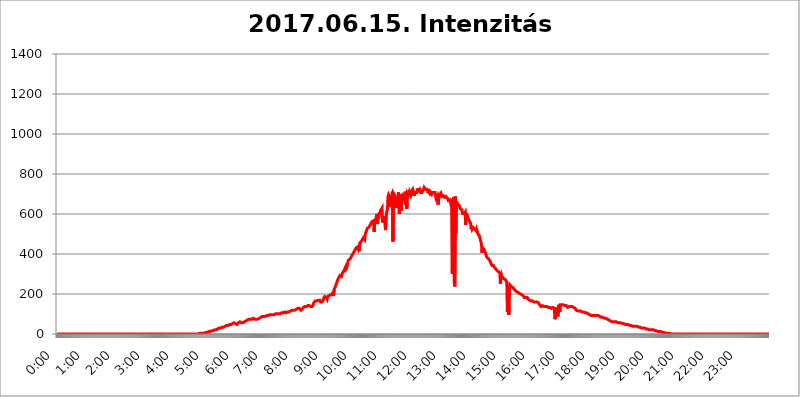
| Category | 2017.06.15. Intenzitás [W/m^2] |
|---|---|
| 0.0 | 0 |
| 0.0006944444444444445 | 0 |
| 0.001388888888888889 | 0 |
| 0.0020833333333333333 | 0 |
| 0.002777777777777778 | 0 |
| 0.003472222222222222 | 0 |
| 0.004166666666666667 | 0 |
| 0.004861111111111111 | 0 |
| 0.005555555555555556 | 0 |
| 0.0062499999999999995 | 0 |
| 0.006944444444444444 | 0 |
| 0.007638888888888889 | 0 |
| 0.008333333333333333 | 0 |
| 0.009027777777777779 | 0 |
| 0.009722222222222222 | 0 |
| 0.010416666666666666 | 0 |
| 0.011111111111111112 | 0 |
| 0.011805555555555555 | 0 |
| 0.012499999999999999 | 0 |
| 0.013194444444444444 | 0 |
| 0.013888888888888888 | 0 |
| 0.014583333333333332 | 0 |
| 0.015277777777777777 | 0 |
| 0.015972222222222224 | 0 |
| 0.016666666666666666 | 0 |
| 0.017361111111111112 | 0 |
| 0.018055555555555557 | 0 |
| 0.01875 | 0 |
| 0.019444444444444445 | 0 |
| 0.02013888888888889 | 0 |
| 0.020833333333333332 | 0 |
| 0.02152777777777778 | 0 |
| 0.022222222222222223 | 0 |
| 0.02291666666666667 | 0 |
| 0.02361111111111111 | 0 |
| 0.024305555555555556 | 0 |
| 0.024999999999999998 | 0 |
| 0.025694444444444447 | 0 |
| 0.02638888888888889 | 0 |
| 0.027083333333333334 | 0 |
| 0.027777777777777776 | 0 |
| 0.02847222222222222 | 0 |
| 0.029166666666666664 | 0 |
| 0.029861111111111113 | 0 |
| 0.030555555555555555 | 0 |
| 0.03125 | 0 |
| 0.03194444444444445 | 0 |
| 0.03263888888888889 | 0 |
| 0.03333333333333333 | 0 |
| 0.034027777777777775 | 0 |
| 0.034722222222222224 | 0 |
| 0.035416666666666666 | 0 |
| 0.036111111111111115 | 0 |
| 0.03680555555555556 | 0 |
| 0.0375 | 0 |
| 0.03819444444444444 | 0 |
| 0.03888888888888889 | 0 |
| 0.03958333333333333 | 0 |
| 0.04027777777777778 | 0 |
| 0.04097222222222222 | 0 |
| 0.041666666666666664 | 0 |
| 0.042361111111111106 | 0 |
| 0.04305555555555556 | 0 |
| 0.043750000000000004 | 0 |
| 0.044444444444444446 | 0 |
| 0.04513888888888889 | 0 |
| 0.04583333333333334 | 0 |
| 0.04652777777777778 | 0 |
| 0.04722222222222222 | 0 |
| 0.04791666666666666 | 0 |
| 0.04861111111111111 | 0 |
| 0.049305555555555554 | 0 |
| 0.049999999999999996 | 0 |
| 0.05069444444444445 | 0 |
| 0.051388888888888894 | 0 |
| 0.052083333333333336 | 0 |
| 0.05277777777777778 | 0 |
| 0.05347222222222222 | 0 |
| 0.05416666666666667 | 0 |
| 0.05486111111111111 | 0 |
| 0.05555555555555555 | 0 |
| 0.05625 | 0 |
| 0.05694444444444444 | 0 |
| 0.057638888888888885 | 0 |
| 0.05833333333333333 | 0 |
| 0.05902777777777778 | 0 |
| 0.059722222222222225 | 0 |
| 0.06041666666666667 | 0 |
| 0.061111111111111116 | 0 |
| 0.06180555555555556 | 0 |
| 0.0625 | 0 |
| 0.06319444444444444 | 0 |
| 0.06388888888888888 | 0 |
| 0.06458333333333334 | 0 |
| 0.06527777777777778 | 0 |
| 0.06597222222222222 | 0 |
| 0.06666666666666667 | 0 |
| 0.06736111111111111 | 0 |
| 0.06805555555555555 | 0 |
| 0.06874999999999999 | 0 |
| 0.06944444444444443 | 0 |
| 0.07013888888888889 | 0 |
| 0.07083333333333333 | 0 |
| 0.07152777777777779 | 0 |
| 0.07222222222222223 | 0 |
| 0.07291666666666667 | 0 |
| 0.07361111111111111 | 0 |
| 0.07430555555555556 | 0 |
| 0.075 | 0 |
| 0.07569444444444444 | 0 |
| 0.0763888888888889 | 0 |
| 0.07708333333333334 | 0 |
| 0.07777777777777778 | 0 |
| 0.07847222222222222 | 0 |
| 0.07916666666666666 | 0 |
| 0.0798611111111111 | 0 |
| 0.08055555555555556 | 0 |
| 0.08125 | 0 |
| 0.08194444444444444 | 0 |
| 0.08263888888888889 | 0 |
| 0.08333333333333333 | 0 |
| 0.08402777777777777 | 0 |
| 0.08472222222222221 | 0 |
| 0.08541666666666665 | 0 |
| 0.08611111111111112 | 0 |
| 0.08680555555555557 | 0 |
| 0.08750000000000001 | 0 |
| 0.08819444444444445 | 0 |
| 0.08888888888888889 | 0 |
| 0.08958333333333333 | 0 |
| 0.09027777777777778 | 0 |
| 0.09097222222222222 | 0 |
| 0.09166666666666667 | 0 |
| 0.09236111111111112 | 0 |
| 0.09305555555555556 | 0 |
| 0.09375 | 0 |
| 0.09444444444444444 | 0 |
| 0.09513888888888888 | 0 |
| 0.09583333333333333 | 0 |
| 0.09652777777777777 | 0 |
| 0.09722222222222222 | 0 |
| 0.09791666666666667 | 0 |
| 0.09861111111111111 | 0 |
| 0.09930555555555555 | 0 |
| 0.09999999999999999 | 0 |
| 0.10069444444444443 | 0 |
| 0.1013888888888889 | 0 |
| 0.10208333333333335 | 0 |
| 0.10277777777777779 | 0 |
| 0.10347222222222223 | 0 |
| 0.10416666666666667 | 0 |
| 0.10486111111111111 | 0 |
| 0.10555555555555556 | 0 |
| 0.10625 | 0 |
| 0.10694444444444444 | 0 |
| 0.1076388888888889 | 0 |
| 0.10833333333333334 | 0 |
| 0.10902777777777778 | 0 |
| 0.10972222222222222 | 0 |
| 0.1111111111111111 | 0 |
| 0.11180555555555556 | 0 |
| 0.11180555555555556 | 0 |
| 0.1125 | 0 |
| 0.11319444444444444 | 0 |
| 0.11388888888888889 | 0 |
| 0.11458333333333333 | 0 |
| 0.11527777777777777 | 0 |
| 0.11597222222222221 | 0 |
| 0.11666666666666665 | 0 |
| 0.1173611111111111 | 0 |
| 0.11805555555555557 | 0 |
| 0.11944444444444445 | 0 |
| 0.12013888888888889 | 0 |
| 0.12083333333333333 | 0 |
| 0.12152777777777778 | 0 |
| 0.12222222222222223 | 0 |
| 0.12291666666666667 | 0 |
| 0.12291666666666667 | 0 |
| 0.12361111111111112 | 0 |
| 0.12430555555555556 | 0 |
| 0.125 | 0 |
| 0.12569444444444444 | 0 |
| 0.12638888888888888 | 0 |
| 0.12708333333333333 | 0 |
| 0.16875 | 0 |
| 0.12847222222222224 | 0 |
| 0.12916666666666668 | 0 |
| 0.12986111111111112 | 0 |
| 0.13055555555555556 | 0 |
| 0.13125 | 0 |
| 0.13194444444444445 | 0 |
| 0.1326388888888889 | 0 |
| 0.13333333333333333 | 0 |
| 0.13402777777777777 | 0 |
| 0.13402777777777777 | 0 |
| 0.13472222222222222 | 0 |
| 0.13541666666666666 | 0 |
| 0.1361111111111111 | 0 |
| 0.13749999999999998 | 0 |
| 0.13819444444444443 | 0 |
| 0.1388888888888889 | 0 |
| 0.13958333333333334 | 0 |
| 0.14027777777777778 | 0 |
| 0.14097222222222222 | 0 |
| 0.14166666666666666 | 0 |
| 0.1423611111111111 | 0 |
| 0.14305555555555557 | 0 |
| 0.14375000000000002 | 0 |
| 0.14444444444444446 | 0 |
| 0.1451388888888889 | 0 |
| 0.1451388888888889 | 0 |
| 0.14652777777777778 | 0 |
| 0.14722222222222223 | 0 |
| 0.14791666666666667 | 0 |
| 0.1486111111111111 | 0 |
| 0.14930555555555555 | 0 |
| 0.15 | 0 |
| 0.15069444444444444 | 0 |
| 0.15138888888888888 | 0 |
| 0.15208333333333332 | 0 |
| 0.15277777777777776 | 0 |
| 0.15347222222222223 | 0 |
| 0.15416666666666667 | 0 |
| 0.15486111111111112 | 0 |
| 0.15555555555555556 | 0 |
| 0.15625 | 0 |
| 0.15694444444444444 | 0 |
| 0.15763888888888888 | 0 |
| 0.15833333333333333 | 0 |
| 0.15902777777777777 | 0 |
| 0.15972222222222224 | 0 |
| 0.16041666666666668 | 0 |
| 0.16111111111111112 | 0 |
| 0.16180555555555556 | 0 |
| 0.1625 | 0 |
| 0.16319444444444445 | 0 |
| 0.1638888888888889 | 0 |
| 0.16458333333333333 | 0 |
| 0.16527777777777777 | 0 |
| 0.16597222222222222 | 0 |
| 0.16666666666666666 | 0 |
| 0.1673611111111111 | 0 |
| 0.16805555555555554 | 0 |
| 0.16874999999999998 | 0 |
| 0.16944444444444443 | 0 |
| 0.17013888888888887 | 0 |
| 0.1708333333333333 | 0 |
| 0.17152777777777775 | 0 |
| 0.17222222222222225 | 0 |
| 0.1729166666666667 | 0 |
| 0.17361111111111113 | 0 |
| 0.17430555555555557 | 0 |
| 0.17500000000000002 | 0 |
| 0.17569444444444446 | 0 |
| 0.1763888888888889 | 0 |
| 0.17708333333333334 | 0 |
| 0.17777777777777778 | 0 |
| 0.17847222222222223 | 0 |
| 0.17916666666666667 | 0 |
| 0.1798611111111111 | 0 |
| 0.18055555555555555 | 0 |
| 0.18125 | 0 |
| 0.18194444444444444 | 0 |
| 0.1826388888888889 | 0 |
| 0.18333333333333335 | 0 |
| 0.1840277777777778 | 0 |
| 0.18472222222222223 | 0 |
| 0.18541666666666667 | 0 |
| 0.18611111111111112 | 0 |
| 0.18680555555555556 | 0 |
| 0.1875 | 0 |
| 0.18819444444444444 | 0 |
| 0.18888888888888888 | 0 |
| 0.18958333333333333 | 0 |
| 0.19027777777777777 | 0 |
| 0.1909722222222222 | 0 |
| 0.19166666666666665 | 0 |
| 0.19236111111111112 | 0 |
| 0.19305555555555554 | 0 |
| 0.19375 | 0 |
| 0.19444444444444445 | 0 |
| 0.1951388888888889 | 0 |
| 0.19583333333333333 | 0 |
| 0.19652777777777777 | 0 |
| 0.19722222222222222 | 0 |
| 0.19791666666666666 | 0 |
| 0.1986111111111111 | 0 |
| 0.19930555555555554 | 3.525 |
| 0.19999999999999998 | 3.525 |
| 0.20069444444444443 | 3.525 |
| 0.20138888888888887 | 3.525 |
| 0.2020833333333333 | 3.525 |
| 0.2027777777777778 | 3.525 |
| 0.2034722222222222 | 3.525 |
| 0.2041666666666667 | 3.525 |
| 0.20486111111111113 | 3.525 |
| 0.20555555555555557 | 3.525 |
| 0.20625000000000002 | 3.525 |
| 0.20694444444444446 | 7.887 |
| 0.2076388888888889 | 3.525 |
| 0.20833333333333334 | 7.887 |
| 0.20902777777777778 | 7.887 |
| 0.20972222222222223 | 7.887 |
| 0.21041666666666667 | 7.887 |
| 0.2111111111111111 | 12.257 |
| 0.21180555555555555 | 12.257 |
| 0.2125 | 12.257 |
| 0.21319444444444444 | 12.257 |
| 0.2138888888888889 | 12.257 |
| 0.21458333333333335 | 12.257 |
| 0.2152777777777778 | 16.636 |
| 0.21597222222222223 | 16.636 |
| 0.21666666666666667 | 16.636 |
| 0.21736111111111112 | 16.636 |
| 0.21805555555555556 | 16.636 |
| 0.21875 | 16.636 |
| 0.21944444444444444 | 21.024 |
| 0.22013888888888888 | 21.024 |
| 0.22083333333333333 | 21.024 |
| 0.22152777777777777 | 21.024 |
| 0.2222222222222222 | 21.024 |
| 0.22291666666666665 | 21.024 |
| 0.2236111111111111 | 25.419 |
| 0.22430555555555556 | 25.419 |
| 0.225 | 25.419 |
| 0.22569444444444445 | 25.419 |
| 0.2263888888888889 | 29.823 |
| 0.22708333333333333 | 29.823 |
| 0.22777777777777777 | 29.823 |
| 0.22847222222222222 | 29.823 |
| 0.22916666666666666 | 29.823 |
| 0.2298611111111111 | 34.234 |
| 0.23055555555555554 | 34.234 |
| 0.23124999999999998 | 34.234 |
| 0.23194444444444443 | 34.234 |
| 0.23263888888888887 | 34.234 |
| 0.2333333333333333 | 34.234 |
| 0.2340277777777778 | 38.653 |
| 0.2347222222222222 | 38.653 |
| 0.2354166666666667 | 38.653 |
| 0.23611111111111113 | 38.653 |
| 0.23680555555555557 | 38.653 |
| 0.23750000000000002 | 43.079 |
| 0.23819444444444446 | 43.079 |
| 0.2388888888888889 | 43.079 |
| 0.23958333333333334 | 43.079 |
| 0.24027777777777778 | 47.511 |
| 0.24097222222222223 | 47.511 |
| 0.24166666666666667 | 47.511 |
| 0.2423611111111111 | 47.511 |
| 0.24305555555555555 | 47.511 |
| 0.24375 | 47.511 |
| 0.24444444444444446 | 51.951 |
| 0.24513888888888888 | 51.951 |
| 0.24583333333333335 | 51.951 |
| 0.2465277777777778 | 51.951 |
| 0.24722222222222223 | 51.951 |
| 0.24791666666666667 | 56.398 |
| 0.24861111111111112 | 51.951 |
| 0.24930555555555556 | 51.951 |
| 0.25 | 51.951 |
| 0.25069444444444444 | 51.951 |
| 0.2513888888888889 | 51.951 |
| 0.2520833333333333 | 47.511 |
| 0.25277777777777777 | 47.511 |
| 0.2534722222222222 | 47.511 |
| 0.25416666666666665 | 56.398 |
| 0.2548611111111111 | 56.398 |
| 0.2555555555555556 | 60.85 |
| 0.25625000000000003 | 60.85 |
| 0.2569444444444445 | 60.85 |
| 0.2576388888888889 | 60.85 |
| 0.25833333333333336 | 56.398 |
| 0.2590277777777778 | 56.398 |
| 0.25972222222222224 | 56.398 |
| 0.2604166666666667 | 56.398 |
| 0.2611111111111111 | 56.398 |
| 0.26180555555555557 | 51.951 |
| 0.2625 | 60.85 |
| 0.26319444444444445 | 60.85 |
| 0.2638888888888889 | 60.85 |
| 0.26458333333333334 | 65.31 |
| 0.2652777777777778 | 69.775 |
| 0.2659722222222222 | 69.775 |
| 0.26666666666666666 | 69.775 |
| 0.2673611111111111 | 69.775 |
| 0.26805555555555555 | 74.246 |
| 0.26875 | 74.246 |
| 0.26944444444444443 | 74.246 |
| 0.2701388888888889 | 74.246 |
| 0.2708333333333333 | 74.246 |
| 0.27152777777777776 | 74.246 |
| 0.2722222222222222 | 74.246 |
| 0.27291666666666664 | 74.246 |
| 0.2736111111111111 | 74.246 |
| 0.2743055555555555 | 78.722 |
| 0.27499999999999997 | 78.722 |
| 0.27569444444444446 | 74.246 |
| 0.27638888888888885 | 74.246 |
| 0.27708333333333335 | 74.246 |
| 0.2777777777777778 | 74.246 |
| 0.27847222222222223 | 74.246 |
| 0.2791666666666667 | 74.246 |
| 0.2798611111111111 | 74.246 |
| 0.28055555555555556 | 74.246 |
| 0.28125 | 74.246 |
| 0.28194444444444444 | 78.722 |
| 0.2826388888888889 | 78.722 |
| 0.2833333333333333 | 78.722 |
| 0.28402777777777777 | 78.722 |
| 0.2847222222222222 | 78.722 |
| 0.28541666666666665 | 83.205 |
| 0.28611111111111115 | 83.205 |
| 0.28680555555555554 | 83.205 |
| 0.28750000000000003 | 87.692 |
| 0.2881944444444445 | 83.205 |
| 0.2888888888888889 | 87.692 |
| 0.28958333333333336 | 87.692 |
| 0.2902777777777778 | 87.692 |
| 0.29097222222222224 | 87.692 |
| 0.2916666666666667 | 87.692 |
| 0.2923611111111111 | 92.184 |
| 0.29305555555555557 | 92.184 |
| 0.29375 | 92.184 |
| 0.29444444444444445 | 92.184 |
| 0.2951388888888889 | 92.184 |
| 0.29583333333333334 | 92.184 |
| 0.2965277777777778 | 92.184 |
| 0.2972222222222222 | 96.682 |
| 0.29791666666666666 | 96.682 |
| 0.2986111111111111 | 96.682 |
| 0.29930555555555555 | 96.682 |
| 0.3 | 96.682 |
| 0.30069444444444443 | 96.682 |
| 0.3013888888888889 | 96.682 |
| 0.3020833333333333 | 96.682 |
| 0.30277777777777776 | 96.682 |
| 0.3034722222222222 | 101.184 |
| 0.30416666666666664 | 96.682 |
| 0.3048611111111111 | 101.184 |
| 0.3055555555555555 | 101.184 |
| 0.30624999999999997 | 101.184 |
| 0.3069444444444444 | 101.184 |
| 0.3076388888888889 | 101.184 |
| 0.30833333333333335 | 101.184 |
| 0.3090277777777778 | 101.184 |
| 0.30972222222222223 | 96.682 |
| 0.3104166666666667 | 101.184 |
| 0.3111111111111111 | 101.184 |
| 0.31180555555555556 | 101.184 |
| 0.3125 | 101.184 |
| 0.31319444444444444 | 105.69 |
| 0.3138888888888889 | 105.69 |
| 0.3145833333333333 | 105.69 |
| 0.31527777777777777 | 105.69 |
| 0.3159722222222222 | 105.69 |
| 0.31666666666666665 | 105.69 |
| 0.31736111111111115 | 105.69 |
| 0.31805555555555554 | 105.69 |
| 0.31875000000000003 | 110.201 |
| 0.3194444444444445 | 110.201 |
| 0.3201388888888889 | 105.69 |
| 0.32083333333333336 | 105.69 |
| 0.3215277777777778 | 105.69 |
| 0.32222222222222224 | 110.201 |
| 0.3229166666666667 | 110.201 |
| 0.3236111111111111 | 110.201 |
| 0.32430555555555557 | 110.201 |
| 0.325 | 110.201 |
| 0.32569444444444445 | 114.716 |
| 0.3263888888888889 | 114.716 |
| 0.32708333333333334 | 114.716 |
| 0.3277777777777778 | 114.716 |
| 0.3284722222222222 | 119.235 |
| 0.32916666666666666 | 119.235 |
| 0.3298611111111111 | 119.235 |
| 0.33055555555555555 | 119.235 |
| 0.33125 | 119.235 |
| 0.33194444444444443 | 119.235 |
| 0.3326388888888889 | 119.235 |
| 0.3333333333333333 | 119.235 |
| 0.3340277777777778 | 119.235 |
| 0.3347222222222222 | 123.758 |
| 0.3354166666666667 | 123.758 |
| 0.3361111111111111 | 128.284 |
| 0.3368055555555556 | 128.284 |
| 0.33749999999999997 | 128.284 |
| 0.33819444444444446 | 128.284 |
| 0.33888888888888885 | 128.284 |
| 0.33958333333333335 | 128.284 |
| 0.34027777777777773 | 128.284 |
| 0.34097222222222223 | 128.284 |
| 0.3416666666666666 | 119.235 |
| 0.3423611111111111 | 123.758 |
| 0.3430555555555555 | 123.758 |
| 0.34375 | 123.758 |
| 0.3444444444444445 | 128.284 |
| 0.3451388888888889 | 132.814 |
| 0.3458333333333334 | 132.814 |
| 0.34652777777777777 | 132.814 |
| 0.34722222222222227 | 137.347 |
| 0.34791666666666665 | 137.347 |
| 0.34861111111111115 | 132.814 |
| 0.34930555555555554 | 137.347 |
| 0.35000000000000003 | 137.347 |
| 0.3506944444444444 | 137.347 |
| 0.3513888888888889 | 141.884 |
| 0.3520833333333333 | 141.884 |
| 0.3527777777777778 | 146.423 |
| 0.3534722222222222 | 141.884 |
| 0.3541666666666667 | 141.884 |
| 0.3548611111111111 | 146.423 |
| 0.35555555555555557 | 137.347 |
| 0.35625 | 132.814 |
| 0.35694444444444445 | 141.884 |
| 0.3576388888888889 | 137.347 |
| 0.35833333333333334 | 141.884 |
| 0.3590277777777778 | 146.423 |
| 0.3597222222222222 | 155.509 |
| 0.36041666666666666 | 155.509 |
| 0.3611111111111111 | 160.056 |
| 0.36180555555555555 | 164.605 |
| 0.3625 | 164.605 |
| 0.36319444444444443 | 164.605 |
| 0.3638888888888889 | 164.605 |
| 0.3645833333333333 | 160.056 |
| 0.3652777777777778 | 164.605 |
| 0.3659722222222222 | 169.156 |
| 0.3666666666666667 | 164.605 |
| 0.3673611111111111 | 169.156 |
| 0.3680555555555556 | 169.156 |
| 0.36874999999999997 | 164.605 |
| 0.36944444444444446 | 160.056 |
| 0.37013888888888885 | 155.509 |
| 0.37083333333333335 | 160.056 |
| 0.37152777777777773 | 160.056 |
| 0.37222222222222223 | 155.509 |
| 0.3729166666666666 | 169.156 |
| 0.3736111111111111 | 178.264 |
| 0.3743055555555555 | 173.709 |
| 0.375 | 187.378 |
| 0.3756944444444445 | 187.378 |
| 0.3763888888888889 | 191.937 |
| 0.3770833333333334 | 182.82 |
| 0.37777777777777777 | 182.82 |
| 0.37847222222222227 | 173.709 |
| 0.37916666666666665 | 187.378 |
| 0.37986111111111115 | 182.82 |
| 0.38055555555555554 | 182.82 |
| 0.38125000000000003 | 191.937 |
| 0.3819444444444444 | 191.937 |
| 0.3826388888888889 | 196.497 |
| 0.3833333333333333 | 196.497 |
| 0.3840277777777778 | 191.937 |
| 0.3847222222222222 | 191.937 |
| 0.3854166666666667 | 196.497 |
| 0.3861111111111111 | 201.058 |
| 0.38680555555555557 | 210.182 |
| 0.3875 | 191.937 |
| 0.38819444444444445 | 219.309 |
| 0.3888888888888889 | 219.309 |
| 0.38958333333333334 | 233 |
| 0.3902777777777778 | 237.564 |
| 0.3909722222222222 | 246.689 |
| 0.39166666666666666 | 251.251 |
| 0.3923611111111111 | 260.373 |
| 0.39305555555555555 | 264.932 |
| 0.39375 | 274.047 |
| 0.39444444444444443 | 278.603 |
| 0.3951388888888889 | 283.156 |
| 0.3958333333333333 | 287.709 |
| 0.3965277777777778 | 292.259 |
| 0.3972222222222222 | 287.709 |
| 0.3979166666666667 | 292.259 |
| 0.3986111111111111 | 287.709 |
| 0.3993055555555556 | 296.808 |
| 0.39999999999999997 | 305.898 |
| 0.40069444444444446 | 310.44 |
| 0.40138888888888885 | 310.44 |
| 0.40208333333333335 | 314.98 |
| 0.40277777777777773 | 314.98 |
| 0.40347222222222223 | 319.517 |
| 0.4041666666666666 | 333.113 |
| 0.4048611111111111 | 324.052 |
| 0.4055555555555555 | 328.584 |
| 0.40625 | 333.113 |
| 0.4069444444444445 | 346.682 |
| 0.4076388888888889 | 360.221 |
| 0.4083333333333334 | 369.23 |
| 0.40902777777777777 | 369.23 |
| 0.40972222222222227 | 369.23 |
| 0.41041666666666665 | 373.729 |
| 0.41111111111111115 | 378.224 |
| 0.41180555555555554 | 382.715 |
| 0.41250000000000003 | 387.202 |
| 0.4131944444444444 | 391.685 |
| 0.4138888888888889 | 396.164 |
| 0.4145833333333333 | 400.638 |
| 0.4152777777777778 | 405.108 |
| 0.4159722222222222 | 405.108 |
| 0.4166666666666667 | 414.035 |
| 0.4173611111111111 | 418.492 |
| 0.41805555555555557 | 422.943 |
| 0.41875 | 427.39 |
| 0.41944444444444445 | 431.833 |
| 0.4201388888888889 | 431.833 |
| 0.42083333333333334 | 436.27 |
| 0.4215277777777778 | 436.27 |
| 0.4222222222222222 | 427.39 |
| 0.42291666666666666 | 436.27 |
| 0.4236111111111111 | 414.035 |
| 0.42430555555555555 | 453.968 |
| 0.425 | 458.38 |
| 0.42569444444444443 | 458.38 |
| 0.4263888888888889 | 462.786 |
| 0.4270833333333333 | 467.187 |
| 0.4277777777777778 | 471.582 |
| 0.4284722222222222 | 475.972 |
| 0.4291666666666667 | 480.356 |
| 0.4298611111111111 | 480.356 |
| 0.4305555555555556 | 475.972 |
| 0.43124999999999997 | 471.582 |
| 0.43194444444444446 | 497.836 |
| 0.43263888888888885 | 506.542 |
| 0.43333333333333335 | 510.885 |
| 0.43402777777777773 | 519.555 |
| 0.43472222222222223 | 528.2 |
| 0.4354166666666666 | 528.2 |
| 0.4361111111111111 | 532.513 |
| 0.4368055555555555 | 532.513 |
| 0.4375 | 532.513 |
| 0.4381944444444445 | 541.121 |
| 0.4388888888888889 | 541.121 |
| 0.4395833333333334 | 549.704 |
| 0.44027777777777777 | 553.986 |
| 0.44097222222222227 | 553.986 |
| 0.44166666666666665 | 562.53 |
| 0.44236111111111115 | 558.261 |
| 0.44305555555555554 | 566.793 |
| 0.44375000000000003 | 566.793 |
| 0.4444444444444444 | 510.885 |
| 0.4451388888888889 | 553.986 |
| 0.4458333333333333 | 549.704 |
| 0.4465277777777778 | 566.793 |
| 0.4472222222222222 | 566.793 |
| 0.4479166666666667 | 592.233 |
| 0.4486111111111111 | 600.661 |
| 0.44930555555555557 | 549.704 |
| 0.45 | 588.009 |
| 0.45069444444444445 | 575.299 |
| 0.4513888888888889 | 596.45 |
| 0.45208333333333334 | 609.062 |
| 0.4527777777777778 | 596.45 |
| 0.4534722222222222 | 617.436 |
| 0.45416666666666666 | 617.436 |
| 0.4548611111111111 | 613.252 |
| 0.45555555555555555 | 629.948 |
| 0.45625 | 558.261 |
| 0.45694444444444443 | 571.049 |
| 0.4576388888888889 | 558.261 |
| 0.4583333333333333 | 588.009 |
| 0.4590277777777778 | 575.299 |
| 0.4597222222222222 | 545.416 |
| 0.4604166666666667 | 519.555 |
| 0.4611111111111111 | 558.261 |
| 0.4618055555555556 | 604.864 |
| 0.46249999999999997 | 609.062 |
| 0.46319444444444446 | 625.784 |
| 0.46388888888888885 | 687.544 |
| 0.46458333333333335 | 695.666 |
| 0.46527777777777773 | 695.666 |
| 0.46597222222222223 | 683.473 |
| 0.4666666666666666 | 634.105 |
| 0.4673611111111111 | 634.105 |
| 0.4680555555555555 | 691.608 |
| 0.46875 | 675.311 |
| 0.4694444444444445 | 695.666 |
| 0.4701388888888889 | 711.832 |
| 0.4708333333333334 | 462.786 |
| 0.47152777777777777 | 703.762 |
| 0.47222222222222227 | 703.762 |
| 0.47291666666666665 | 699.717 |
| 0.47361111111111115 | 691.608 |
| 0.47430555555555554 | 679.395 |
| 0.47500000000000003 | 629.948 |
| 0.4756944444444444 | 642.4 |
| 0.4763888888888889 | 650.667 |
| 0.4770833333333333 | 671.22 |
| 0.4777777777777778 | 683.473 |
| 0.4784722222222222 | 707.8 |
| 0.4791666666666667 | 703.762 |
| 0.4798611111111111 | 600.661 |
| 0.48055555555555557 | 699.717 |
| 0.48125 | 683.473 |
| 0.48194444444444445 | 687.544 |
| 0.4826388888888889 | 617.436 |
| 0.48333333333333334 | 683.473 |
| 0.4840277777777778 | 691.608 |
| 0.4847222222222222 | 691.608 |
| 0.48541666666666666 | 683.473 |
| 0.4861111111111111 | 683.473 |
| 0.48680555555555555 | 663.019 |
| 0.4875 | 703.762 |
| 0.48819444444444443 | 711.832 |
| 0.4888888888888889 | 646.537 |
| 0.4895833333333333 | 695.666 |
| 0.4902777777777778 | 625.784 |
| 0.4909722222222222 | 703.762 |
| 0.4916666666666667 | 707.8 |
| 0.4923611111111111 | 695.666 |
| 0.4930555555555556 | 699.717 |
| 0.49374999999999997 | 711.832 |
| 0.49444444444444446 | 703.762 |
| 0.49513888888888885 | 703.762 |
| 0.49583333333333335 | 691.608 |
| 0.49652777777777773 | 699.717 |
| 0.49722222222222223 | 715.858 |
| 0.4979166666666666 | 711.832 |
| 0.4986111111111111 | 723.889 |
| 0.4993055555555555 | 719.877 |
| 0.5 | 703.762 |
| 0.5006944444444444 | 691.608 |
| 0.5013888888888889 | 695.666 |
| 0.5020833333333333 | 707.8 |
| 0.5027777777777778 | 707.8 |
| 0.5034722222222222 | 711.832 |
| 0.5041666666666667 | 707.8 |
| 0.5048611111111111 | 715.858 |
| 0.5055555555555555 | 727.896 |
| 0.50625 | 715.858 |
| 0.5069444444444444 | 711.832 |
| 0.5076388888888889 | 715.858 |
| 0.5083333333333333 | 723.889 |
| 0.5090277777777777 | 723.889 |
| 0.5097222222222222 | 707.8 |
| 0.5104166666666666 | 711.832 |
| 0.5111111111111112 | 703.762 |
| 0.5118055555555555 | 707.8 |
| 0.5125000000000001 | 715.858 |
| 0.5131944444444444 | 719.877 |
| 0.513888888888889 | 723.889 |
| 0.5145833333333333 | 731.896 |
| 0.5152777777777778 | 727.896 |
| 0.5159722222222222 | 723.889 |
| 0.5166666666666667 | 727.896 |
| 0.517361111111111 | 719.877 |
| 0.5180555555555556 | 723.889 |
| 0.5187499999999999 | 723.889 |
| 0.5194444444444445 | 715.858 |
| 0.5201388888888888 | 703.762 |
| 0.5208333333333334 | 711.832 |
| 0.5215277777777778 | 707.8 |
| 0.5222222222222223 | 703.762 |
| 0.5229166666666667 | 711.832 |
| 0.5236111111111111 | 711.832 |
| 0.5243055555555556 | 711.832 |
| 0.525 | 699.717 |
| 0.5256944444444445 | 707.8 |
| 0.5263888888888889 | 703.762 |
| 0.5270833333333333 | 707.8 |
| 0.5277777777777778 | 707.8 |
| 0.5284722222222222 | 703.762 |
| 0.5291666666666667 | 703.762 |
| 0.5298611111111111 | 707.8 |
| 0.5305555555555556 | 695.666 |
| 0.53125 | 679.395 |
| 0.5319444444444444 | 683.473 |
| 0.5326388888888889 | 679.395 |
| 0.5333333333333333 | 691.608 |
| 0.5340277777777778 | 646.537 |
| 0.5347222222222222 | 667.123 |
| 0.5354166666666667 | 687.544 |
| 0.5361111111111111 | 691.608 |
| 0.5368055555555555 | 695.666 |
| 0.5375 | 699.717 |
| 0.5381944444444444 | 703.762 |
| 0.5388888888888889 | 695.666 |
| 0.5395833333333333 | 687.544 |
| 0.5402777777777777 | 687.544 |
| 0.5409722222222222 | 683.473 |
| 0.5416666666666666 | 691.608 |
| 0.5423611111111112 | 687.544 |
| 0.5430555555555555 | 683.473 |
| 0.5437500000000001 | 683.473 |
| 0.5444444444444444 | 683.473 |
| 0.545138888888889 | 687.544 |
| 0.5458333333333333 | 691.608 |
| 0.5465277777777778 | 683.473 |
| 0.5472222222222222 | 679.395 |
| 0.5479166666666667 | 675.311 |
| 0.548611111111111 | 667.123 |
| 0.5493055555555556 | 671.22 |
| 0.5499999999999999 | 671.22 |
| 0.5506944444444445 | 671.22 |
| 0.5513888888888888 | 663.019 |
| 0.5520833333333334 | 658.909 |
| 0.5527777777777778 | 638.256 |
| 0.5534722222222223 | 675.311 |
| 0.5541666666666667 | 301.354 |
| 0.5548611111111111 | 671.22 |
| 0.5555555555555556 | 541.121 |
| 0.55625 | 683.473 |
| 0.5569444444444445 | 255.813 |
| 0.5576388888888889 | 237.564 |
| 0.5583333333333333 | 687.544 |
| 0.5590277777777778 | 502.192 |
| 0.5597222222222222 | 663.019 |
| 0.5604166666666667 | 667.123 |
| 0.5611111111111111 | 658.909 |
| 0.5618055555555556 | 646.537 |
| 0.5625 | 642.4 |
| 0.5631944444444444 | 642.4 |
| 0.5638888888888889 | 642.4 |
| 0.5645833333333333 | 634.105 |
| 0.5652777777777778 | 625.784 |
| 0.5659722222222222 | 621.613 |
| 0.5666666666666667 | 621.613 |
| 0.5673611111111111 | 621.613 |
| 0.5680555555555555 | 609.062 |
| 0.56875 | 600.661 |
| 0.5694444444444444 | 600.661 |
| 0.5701388888888889 | 600.661 |
| 0.5708333333333333 | 600.661 |
| 0.5715277777777777 | 596.45 |
| 0.5722222222222222 | 609.062 |
| 0.5729166666666666 | 545.416 |
| 0.5736111111111112 | 604.864 |
| 0.5743055555555555 | 600.661 |
| 0.5750000000000001 | 592.233 |
| 0.5756944444444444 | 583.779 |
| 0.576388888888889 | 579.542 |
| 0.5770833333333333 | 571.049 |
| 0.5777777777777778 | 566.793 |
| 0.5784722222222222 | 566.793 |
| 0.5791666666666667 | 558.261 |
| 0.579861111111111 | 549.704 |
| 0.5805555555555556 | 523.88 |
| 0.5812499999999999 | 536.82 |
| 0.5819444444444445 | 523.88 |
| 0.5826388888888888 | 528.2 |
| 0.5833333333333334 | 532.513 |
| 0.5840277777777778 | 532.513 |
| 0.5847222222222223 | 528.2 |
| 0.5854166666666667 | 523.88 |
| 0.5861111111111111 | 523.88 |
| 0.5868055555555556 | 523.88 |
| 0.5875 | 515.223 |
| 0.5881944444444445 | 523.88 |
| 0.5888888888888889 | 515.223 |
| 0.5895833333333333 | 506.542 |
| 0.5902777777777778 | 497.836 |
| 0.5909722222222222 | 497.836 |
| 0.5916666666666667 | 493.475 |
| 0.5923611111111111 | 489.108 |
| 0.5930555555555556 | 475.972 |
| 0.59375 | 467.187 |
| 0.5944444444444444 | 458.38 |
| 0.5951388888888889 | 440.702 |
| 0.5958333333333333 | 405.108 |
| 0.5965277777777778 | 431.833 |
| 0.5972222222222222 | 431.833 |
| 0.5979166666666667 | 427.39 |
| 0.5986111111111111 | 422.943 |
| 0.5993055555555555 | 414.035 |
| 0.6 | 409.574 |
| 0.6006944444444444 | 405.108 |
| 0.6013888888888889 | 396.164 |
| 0.6020833333333333 | 387.202 |
| 0.6027777777777777 | 387.202 |
| 0.6034722222222222 | 382.715 |
| 0.6041666666666666 | 378.224 |
| 0.6048611111111112 | 378.224 |
| 0.6055555555555555 | 373.729 |
| 0.6062500000000001 | 369.23 |
| 0.6069444444444444 | 364.728 |
| 0.607638888888889 | 360.221 |
| 0.6083333333333333 | 351.198 |
| 0.6090277777777778 | 351.198 |
| 0.6097222222222222 | 342.162 |
| 0.6104166666666667 | 342.162 |
| 0.611111111111111 | 342.162 |
| 0.6118055555555556 | 342.162 |
| 0.6124999999999999 | 342.162 |
| 0.6131944444444445 | 333.113 |
| 0.6138888888888888 | 333.113 |
| 0.6145833333333334 | 328.584 |
| 0.6152777777777778 | 324.052 |
| 0.6159722222222223 | 324.052 |
| 0.6166666666666667 | 319.517 |
| 0.6173611111111111 | 314.98 |
| 0.6180555555555556 | 314.98 |
| 0.61875 | 310.44 |
| 0.6194444444444445 | 310.44 |
| 0.6201388888888889 | 305.898 |
| 0.6208333333333333 | 301.354 |
| 0.6215277777777778 | 251.251 |
| 0.6222222222222222 | 287.709 |
| 0.6229166666666667 | 296.808 |
| 0.6236111111111111 | 287.709 |
| 0.6243055555555556 | 287.709 |
| 0.625 | 283.156 |
| 0.6256944444444444 | 278.603 |
| 0.6263888888888889 | 278.603 |
| 0.6270833333333333 | 278.603 |
| 0.6277777777777778 | 274.047 |
| 0.6284722222222222 | 269.49 |
| 0.6291666666666667 | 269.49 |
| 0.6298611111111111 | 264.932 |
| 0.6305555555555555 | 251.251 |
| 0.63125 | 110.201 |
| 0.6319444444444444 | 119.235 |
| 0.6326388888888889 | 223.873 |
| 0.6333333333333333 | 96.682 |
| 0.6340277777777777 | 228.436 |
| 0.6347222222222222 | 246.689 |
| 0.6354166666666666 | 246.689 |
| 0.6361111111111112 | 242.127 |
| 0.6368055555555555 | 237.564 |
| 0.6375000000000001 | 237.564 |
| 0.6381944444444444 | 233 |
| 0.638888888888889 | 233 |
| 0.6395833333333333 | 228.436 |
| 0.6402777777777778 | 228.436 |
| 0.6409722222222222 | 223.873 |
| 0.6416666666666667 | 219.309 |
| 0.642361111111111 | 219.309 |
| 0.6430555555555556 | 214.746 |
| 0.6437499999999999 | 214.746 |
| 0.6444444444444445 | 210.182 |
| 0.6451388888888888 | 210.182 |
| 0.6458333333333334 | 205.62 |
| 0.6465277777777778 | 205.62 |
| 0.6472222222222223 | 205.62 |
| 0.6479166666666667 | 205.62 |
| 0.6486111111111111 | 201.058 |
| 0.6493055555555556 | 201.058 |
| 0.65 | 201.058 |
| 0.6506944444444445 | 196.497 |
| 0.6513888888888889 | 196.497 |
| 0.6520833333333333 | 191.937 |
| 0.6527777777777778 | 191.937 |
| 0.6534722222222222 | 191.937 |
| 0.6541666666666667 | 187.378 |
| 0.6548611111111111 | 182.82 |
| 0.6555555555555556 | 182.82 |
| 0.65625 | 187.378 |
| 0.6569444444444444 | 182.82 |
| 0.6576388888888889 | 182.82 |
| 0.6583333333333333 | 182.82 |
| 0.6590277777777778 | 182.82 |
| 0.6597222222222222 | 178.264 |
| 0.6604166666666667 | 173.709 |
| 0.6611111111111111 | 173.709 |
| 0.6618055555555555 | 169.156 |
| 0.6625 | 169.156 |
| 0.6631944444444444 | 169.156 |
| 0.6638888888888889 | 169.156 |
| 0.6645833333333333 | 164.605 |
| 0.6652777777777777 | 164.605 |
| 0.6659722222222222 | 164.605 |
| 0.6666666666666666 | 164.605 |
| 0.6673611111111111 | 160.056 |
| 0.6680555555555556 | 160.056 |
| 0.6687500000000001 | 160.056 |
| 0.6694444444444444 | 160.056 |
| 0.6701388888888888 | 160.056 |
| 0.6708333333333334 | 160.056 |
| 0.6715277777777778 | 160.056 |
| 0.6722222222222222 | 160.056 |
| 0.6729166666666666 | 160.056 |
| 0.6736111111111112 | 160.056 |
| 0.6743055555555556 | 155.509 |
| 0.6749999999999999 | 155.509 |
| 0.6756944444444444 | 150.964 |
| 0.6763888888888889 | 146.423 |
| 0.6770833333333334 | 141.884 |
| 0.6777777777777777 | 141.884 |
| 0.6784722222222223 | 137.347 |
| 0.6791666666666667 | 137.347 |
| 0.6798611111111111 | 137.347 |
| 0.6805555555555555 | 141.884 |
| 0.68125 | 141.884 |
| 0.6819444444444445 | 141.884 |
| 0.6826388888888889 | 137.347 |
| 0.6833333333333332 | 137.347 |
| 0.6840277777777778 | 137.347 |
| 0.6847222222222222 | 137.347 |
| 0.6854166666666667 | 137.347 |
| 0.686111111111111 | 137.347 |
| 0.6868055555555556 | 137.347 |
| 0.6875 | 137.347 |
| 0.6881944444444444 | 137.347 |
| 0.688888888888889 | 132.814 |
| 0.6895833333333333 | 132.814 |
| 0.6902777777777778 | 132.814 |
| 0.6909722222222222 | 132.814 |
| 0.6916666666666668 | 128.284 |
| 0.6923611111111111 | 128.284 |
| 0.6930555555555555 | 128.284 |
| 0.69375 | 132.814 |
| 0.6944444444444445 | 132.814 |
| 0.6951388888888889 | 132.814 |
| 0.6958333333333333 | 128.284 |
| 0.6965277777777777 | 128.284 |
| 0.6972222222222223 | 128.284 |
| 0.6979166666666666 | 74.246 |
| 0.6986111111111111 | 78.722 |
| 0.6993055555555556 | 87.692 |
| 0.7000000000000001 | 132.814 |
| 0.7006944444444444 | 132.814 |
| 0.7013888888888888 | 101.184 |
| 0.7020833333333334 | 87.692 |
| 0.7027777777777778 | 101.184 |
| 0.7034722222222222 | 146.423 |
| 0.7041666666666666 | 146.423 |
| 0.7048611111111112 | 110.201 |
| 0.7055555555555556 | 146.423 |
| 0.7062499999999999 | 146.423 |
| 0.7069444444444444 | 146.423 |
| 0.7076388888888889 | 146.423 |
| 0.7083333333333334 | 146.423 |
| 0.7090277777777777 | 146.423 |
| 0.7097222222222223 | 146.423 |
| 0.7104166666666667 | 141.884 |
| 0.7111111111111111 | 141.884 |
| 0.7118055555555555 | 141.884 |
| 0.7125 | 141.884 |
| 0.7131944444444445 | 141.884 |
| 0.7138888888888889 | 141.884 |
| 0.7145833333333332 | 141.884 |
| 0.7152777777777778 | 137.347 |
| 0.7159722222222222 | 132.814 |
| 0.7166666666666667 | 132.814 |
| 0.717361111111111 | 132.814 |
| 0.7180555555555556 | 137.347 |
| 0.71875 | 137.347 |
| 0.7194444444444444 | 137.347 |
| 0.720138888888889 | 137.347 |
| 0.7208333333333333 | 137.347 |
| 0.7215277777777778 | 137.347 |
| 0.7222222222222222 | 137.347 |
| 0.7229166666666668 | 137.347 |
| 0.7236111111111111 | 132.814 |
| 0.7243055555555555 | 132.814 |
| 0.725 | 132.814 |
| 0.7256944444444445 | 132.814 |
| 0.7263888888888889 | 128.284 |
| 0.7270833333333333 | 123.758 |
| 0.7277777777777777 | 119.235 |
| 0.7284722222222223 | 119.235 |
| 0.7291666666666666 | 114.716 |
| 0.7298611111111111 | 114.716 |
| 0.7305555555555556 | 114.716 |
| 0.7312500000000001 | 114.716 |
| 0.7319444444444444 | 114.716 |
| 0.7326388888888888 | 114.716 |
| 0.7333333333333334 | 114.716 |
| 0.7340277777777778 | 114.716 |
| 0.7347222222222222 | 114.716 |
| 0.7354166666666666 | 110.201 |
| 0.7361111111111112 | 110.201 |
| 0.7368055555555556 | 110.201 |
| 0.7374999999999999 | 110.201 |
| 0.7381944444444444 | 110.201 |
| 0.7388888888888889 | 105.69 |
| 0.7395833333333334 | 105.69 |
| 0.7402777777777777 | 105.69 |
| 0.7409722222222223 | 105.69 |
| 0.7416666666666667 | 105.69 |
| 0.7423611111111111 | 105.69 |
| 0.7430555555555555 | 101.184 |
| 0.74375 | 101.184 |
| 0.7444444444444445 | 101.184 |
| 0.7451388888888889 | 96.682 |
| 0.7458333333333332 | 96.682 |
| 0.7465277777777778 | 96.682 |
| 0.7472222222222222 | 96.682 |
| 0.7479166666666667 | 96.682 |
| 0.748611111111111 | 92.184 |
| 0.7493055555555556 | 92.184 |
| 0.75 | 92.184 |
| 0.7506944444444444 | 92.184 |
| 0.751388888888889 | 92.184 |
| 0.7520833333333333 | 92.184 |
| 0.7527777777777778 | 92.184 |
| 0.7534722222222222 | 92.184 |
| 0.7541666666666668 | 92.184 |
| 0.7548611111111111 | 92.184 |
| 0.7555555555555555 | 92.184 |
| 0.75625 | 92.184 |
| 0.7569444444444445 | 92.184 |
| 0.7576388888888889 | 92.184 |
| 0.7583333333333333 | 92.184 |
| 0.7590277777777777 | 92.184 |
| 0.7597222222222223 | 92.184 |
| 0.7604166666666666 | 92.184 |
| 0.7611111111111111 | 87.692 |
| 0.7618055555555556 | 87.692 |
| 0.7625000000000001 | 87.692 |
| 0.7631944444444444 | 83.205 |
| 0.7638888888888888 | 83.205 |
| 0.7645833333333334 | 83.205 |
| 0.7652777777777778 | 83.205 |
| 0.7659722222222222 | 83.205 |
| 0.7666666666666666 | 78.722 |
| 0.7673611111111112 | 78.722 |
| 0.7680555555555556 | 78.722 |
| 0.7687499999999999 | 78.722 |
| 0.7694444444444444 | 78.722 |
| 0.7701388888888889 | 78.722 |
| 0.7708333333333334 | 74.246 |
| 0.7715277777777777 | 74.246 |
| 0.7722222222222223 | 69.775 |
| 0.7729166666666667 | 69.775 |
| 0.7736111111111111 | 69.775 |
| 0.7743055555555555 | 65.31 |
| 0.775 | 65.31 |
| 0.7756944444444445 | 65.31 |
| 0.7763888888888889 | 65.31 |
| 0.7770833333333332 | 65.31 |
| 0.7777777777777778 | 60.85 |
| 0.7784722222222222 | 65.31 |
| 0.7791666666666667 | 60.85 |
| 0.779861111111111 | 60.85 |
| 0.7805555555555556 | 60.85 |
| 0.78125 | 60.85 |
| 0.7819444444444444 | 60.85 |
| 0.782638888888889 | 60.85 |
| 0.7833333333333333 | 60.85 |
| 0.7840277777777778 | 60.85 |
| 0.7847222222222222 | 56.398 |
| 0.7854166666666668 | 56.398 |
| 0.7861111111111111 | 56.398 |
| 0.7868055555555555 | 56.398 |
| 0.7875 | 56.398 |
| 0.7881944444444445 | 56.398 |
| 0.7888888888888889 | 56.398 |
| 0.7895833333333333 | 56.398 |
| 0.7902777777777777 | 56.398 |
| 0.7909722222222223 | 51.951 |
| 0.7916666666666666 | 51.951 |
| 0.7923611111111111 | 51.951 |
| 0.7930555555555556 | 51.951 |
| 0.7937500000000001 | 51.951 |
| 0.7944444444444444 | 51.951 |
| 0.7951388888888888 | 51.951 |
| 0.7958333333333334 | 51.951 |
| 0.7965277777777778 | 47.511 |
| 0.7972222222222222 | 47.511 |
| 0.7979166666666666 | 47.511 |
| 0.7986111111111112 | 47.511 |
| 0.7993055555555556 | 47.511 |
| 0.7999999999999999 | 47.511 |
| 0.8006944444444444 | 47.511 |
| 0.8013888888888889 | 47.511 |
| 0.8020833333333334 | 43.079 |
| 0.8027777777777777 | 43.079 |
| 0.8034722222222223 | 43.079 |
| 0.8041666666666667 | 43.079 |
| 0.8048611111111111 | 43.079 |
| 0.8055555555555555 | 43.079 |
| 0.80625 | 38.653 |
| 0.8069444444444445 | 38.653 |
| 0.8076388888888889 | 38.653 |
| 0.8083333333333332 | 38.653 |
| 0.8090277777777778 | 38.653 |
| 0.8097222222222222 | 38.653 |
| 0.8104166666666667 | 38.653 |
| 0.811111111111111 | 38.653 |
| 0.8118055555555556 | 38.653 |
| 0.8125 | 34.234 |
| 0.8131944444444444 | 38.653 |
| 0.813888888888889 | 34.234 |
| 0.8145833333333333 | 34.234 |
| 0.8152777777777778 | 34.234 |
| 0.8159722222222222 | 34.234 |
| 0.8166666666666668 | 34.234 |
| 0.8173611111111111 | 34.234 |
| 0.8180555555555555 | 34.234 |
| 0.81875 | 29.823 |
| 0.8194444444444445 | 29.823 |
| 0.8201388888888889 | 29.823 |
| 0.8208333333333333 | 29.823 |
| 0.8215277777777777 | 29.823 |
| 0.8222222222222223 | 29.823 |
| 0.8229166666666666 | 29.823 |
| 0.8236111111111111 | 29.823 |
| 0.8243055555555556 | 29.823 |
| 0.8250000000000001 | 29.823 |
| 0.8256944444444444 | 25.419 |
| 0.8263888888888888 | 25.419 |
| 0.8270833333333334 | 25.419 |
| 0.8277777777777778 | 25.419 |
| 0.8284722222222222 | 25.419 |
| 0.8291666666666666 | 25.419 |
| 0.8298611111111112 | 21.024 |
| 0.8305555555555556 | 25.419 |
| 0.8312499999999999 | 21.024 |
| 0.8319444444444444 | 21.024 |
| 0.8326388888888889 | 21.024 |
| 0.8333333333333334 | 21.024 |
| 0.8340277777777777 | 21.024 |
| 0.8347222222222223 | 21.024 |
| 0.8354166666666667 | 21.024 |
| 0.8361111111111111 | 21.024 |
| 0.8368055555555555 | 21.024 |
| 0.8375 | 16.636 |
| 0.8381944444444445 | 16.636 |
| 0.8388888888888889 | 16.636 |
| 0.8395833333333332 | 16.636 |
| 0.8402777777777778 | 16.636 |
| 0.8409722222222222 | 16.636 |
| 0.8416666666666667 | 16.636 |
| 0.842361111111111 | 12.257 |
| 0.8430555555555556 | 12.257 |
| 0.84375 | 12.257 |
| 0.8444444444444444 | 12.257 |
| 0.845138888888889 | 12.257 |
| 0.8458333333333333 | 12.257 |
| 0.8465277777777778 | 12.257 |
| 0.8472222222222222 | 12.257 |
| 0.8479166666666668 | 7.887 |
| 0.8486111111111111 | 7.887 |
| 0.8493055555555555 | 7.887 |
| 0.85 | 7.887 |
| 0.8506944444444445 | 7.887 |
| 0.8513888888888889 | 7.887 |
| 0.8520833333333333 | 7.887 |
| 0.8527777777777777 | 3.525 |
| 0.8534722222222223 | 3.525 |
| 0.8541666666666666 | 3.525 |
| 0.8548611111111111 | 3.525 |
| 0.8555555555555556 | 3.525 |
| 0.8562500000000001 | 3.525 |
| 0.8569444444444444 | 3.525 |
| 0.8576388888888888 | 3.525 |
| 0.8583333333333334 | 3.525 |
| 0.8590277777777778 | 3.525 |
| 0.8597222222222222 | 3.525 |
| 0.8604166666666666 | 3.525 |
| 0.8611111111111112 | 0 |
| 0.8618055555555556 | 0 |
| 0.8624999999999999 | 0 |
| 0.8631944444444444 | 0 |
| 0.8638888888888889 | 0 |
| 0.8645833333333334 | 0 |
| 0.8652777777777777 | 0 |
| 0.8659722222222223 | 0 |
| 0.8666666666666667 | 0 |
| 0.8673611111111111 | 0 |
| 0.8680555555555555 | 0 |
| 0.86875 | 0 |
| 0.8694444444444445 | 0 |
| 0.8701388888888889 | 0 |
| 0.8708333333333332 | 0 |
| 0.8715277777777778 | 0 |
| 0.8722222222222222 | 0 |
| 0.8729166666666667 | 0 |
| 0.873611111111111 | 0 |
| 0.8743055555555556 | 0 |
| 0.875 | 0 |
| 0.8756944444444444 | 0 |
| 0.876388888888889 | 0 |
| 0.8770833333333333 | 0 |
| 0.8777777777777778 | 0 |
| 0.8784722222222222 | 0 |
| 0.8791666666666668 | 0 |
| 0.8798611111111111 | 0 |
| 0.8805555555555555 | 0 |
| 0.88125 | 0 |
| 0.8819444444444445 | 0 |
| 0.8826388888888889 | 0 |
| 0.8833333333333333 | 0 |
| 0.8840277777777777 | 0 |
| 0.8847222222222223 | 0 |
| 0.8854166666666666 | 0 |
| 0.8861111111111111 | 0 |
| 0.8868055555555556 | 0 |
| 0.8875000000000001 | 0 |
| 0.8881944444444444 | 0 |
| 0.8888888888888888 | 0 |
| 0.8895833333333334 | 0 |
| 0.8902777777777778 | 0 |
| 0.8909722222222222 | 0 |
| 0.8916666666666666 | 0 |
| 0.8923611111111112 | 0 |
| 0.8930555555555556 | 0 |
| 0.8937499999999999 | 0 |
| 0.8944444444444444 | 0 |
| 0.8951388888888889 | 0 |
| 0.8958333333333334 | 0 |
| 0.8965277777777777 | 0 |
| 0.8972222222222223 | 0 |
| 0.8979166666666667 | 0 |
| 0.8986111111111111 | 0 |
| 0.8993055555555555 | 0 |
| 0.9 | 0 |
| 0.9006944444444445 | 0 |
| 0.9013888888888889 | 0 |
| 0.9020833333333332 | 0 |
| 0.9027777777777778 | 0 |
| 0.9034722222222222 | 0 |
| 0.9041666666666667 | 0 |
| 0.904861111111111 | 0 |
| 0.9055555555555556 | 0 |
| 0.90625 | 0 |
| 0.9069444444444444 | 0 |
| 0.907638888888889 | 0 |
| 0.9083333333333333 | 0 |
| 0.9090277777777778 | 0 |
| 0.9097222222222222 | 0 |
| 0.9104166666666668 | 0 |
| 0.9111111111111111 | 0 |
| 0.9118055555555555 | 0 |
| 0.9125 | 0 |
| 0.9131944444444445 | 0 |
| 0.9138888888888889 | 0 |
| 0.9145833333333333 | 0 |
| 0.9152777777777777 | 0 |
| 0.9159722222222223 | 0 |
| 0.9166666666666666 | 0 |
| 0.9173611111111111 | 0 |
| 0.9180555555555556 | 0 |
| 0.9187500000000001 | 0 |
| 0.9194444444444444 | 0 |
| 0.9201388888888888 | 0 |
| 0.9208333333333334 | 0 |
| 0.9215277777777778 | 0 |
| 0.9222222222222222 | 0 |
| 0.9229166666666666 | 0 |
| 0.9236111111111112 | 0 |
| 0.9243055555555556 | 0 |
| 0.9249999999999999 | 0 |
| 0.9256944444444444 | 0 |
| 0.9263888888888889 | 0 |
| 0.9270833333333334 | 0 |
| 0.9277777777777777 | 0 |
| 0.9284722222222223 | 0 |
| 0.9291666666666667 | 0 |
| 0.9298611111111111 | 0 |
| 0.9305555555555555 | 0 |
| 0.93125 | 0 |
| 0.9319444444444445 | 0 |
| 0.9326388888888889 | 0 |
| 0.9333333333333332 | 0 |
| 0.9340277777777778 | 0 |
| 0.9347222222222222 | 0 |
| 0.9354166666666667 | 0 |
| 0.936111111111111 | 0 |
| 0.9368055555555556 | 0 |
| 0.9375 | 0 |
| 0.9381944444444444 | 0 |
| 0.938888888888889 | 0 |
| 0.9395833333333333 | 0 |
| 0.9402777777777778 | 0 |
| 0.9409722222222222 | 0 |
| 0.9416666666666668 | 0 |
| 0.9423611111111111 | 0 |
| 0.9430555555555555 | 0 |
| 0.94375 | 0 |
| 0.9444444444444445 | 0 |
| 0.9451388888888889 | 0 |
| 0.9458333333333333 | 0 |
| 0.9465277777777777 | 0 |
| 0.9472222222222223 | 0 |
| 0.9479166666666666 | 0 |
| 0.9486111111111111 | 0 |
| 0.9493055555555556 | 0 |
| 0.9500000000000001 | 0 |
| 0.9506944444444444 | 0 |
| 0.9513888888888888 | 0 |
| 0.9520833333333334 | 0 |
| 0.9527777777777778 | 0 |
| 0.9534722222222222 | 0 |
| 0.9541666666666666 | 0 |
| 0.9548611111111112 | 0 |
| 0.9555555555555556 | 0 |
| 0.9562499999999999 | 0 |
| 0.9569444444444444 | 0 |
| 0.9576388888888889 | 0 |
| 0.9583333333333334 | 0 |
| 0.9590277777777777 | 0 |
| 0.9597222222222223 | 0 |
| 0.9604166666666667 | 0 |
| 0.9611111111111111 | 0 |
| 0.9618055555555555 | 0 |
| 0.9625 | 0 |
| 0.9631944444444445 | 0 |
| 0.9638888888888889 | 0 |
| 0.9645833333333332 | 0 |
| 0.9652777777777778 | 0 |
| 0.9659722222222222 | 0 |
| 0.9666666666666667 | 0 |
| 0.967361111111111 | 0 |
| 0.9680555555555556 | 0 |
| 0.96875 | 0 |
| 0.9694444444444444 | 0 |
| 0.970138888888889 | 0 |
| 0.9708333333333333 | 0 |
| 0.9715277777777778 | 0 |
| 0.9722222222222222 | 0 |
| 0.9729166666666668 | 0 |
| 0.9736111111111111 | 0 |
| 0.9743055555555555 | 0 |
| 0.975 | 0 |
| 0.9756944444444445 | 0 |
| 0.9763888888888889 | 0 |
| 0.9770833333333333 | 0 |
| 0.9777777777777777 | 0 |
| 0.9784722222222223 | 0 |
| 0.9791666666666666 | 0 |
| 0.9798611111111111 | 0 |
| 0.9805555555555556 | 0 |
| 0.9812500000000001 | 0 |
| 0.9819444444444444 | 0 |
| 0.9826388888888888 | 0 |
| 0.9833333333333334 | 0 |
| 0.9840277777777778 | 0 |
| 0.9847222222222222 | 0 |
| 0.9854166666666666 | 0 |
| 0.9861111111111112 | 0 |
| 0.9868055555555556 | 0 |
| 0.9874999999999999 | 0 |
| 0.9881944444444444 | 0 |
| 0.9888888888888889 | 0 |
| 0.9895833333333334 | 0 |
| 0.9902777777777777 | 0 |
| 0.9909722222222223 | 0 |
| 0.9916666666666667 | 0 |
| 0.9923611111111111 | 0 |
| 0.9930555555555555 | 0 |
| 0.99375 | 0 |
| 0.9944444444444445 | 0 |
| 0.9951388888888889 | 0 |
| 0.9958333333333332 | 0 |
| 0.9965277777777778 | 0 |
| 0.9972222222222222 | 0 |
| 0.9979166666666667 | 0 |
| 0.998611111111111 | 0 |
| 0.9993055555555556 | 0 |